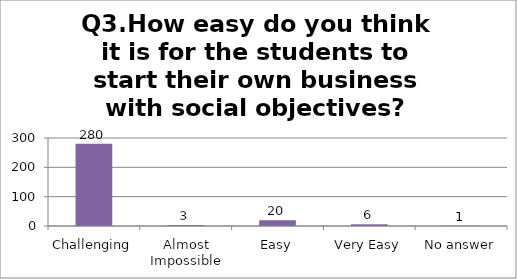
| Category | Q3.How easy do you think it is for the students to start their own business with social objectives? |
|---|---|
| Challenging | 280 |
| Almost Impossible | 3 |
| Easy | 20 |
| Very Easy | 6 |
| No answer | 1 |